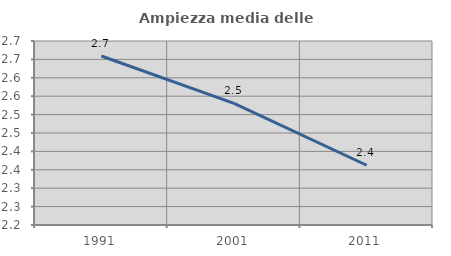
| Category | Ampiezza media delle famiglie |
|---|---|
| 1991.0 | 2.659 |
| 2001.0 | 2.53 |
| 2011.0 | 2.362 |